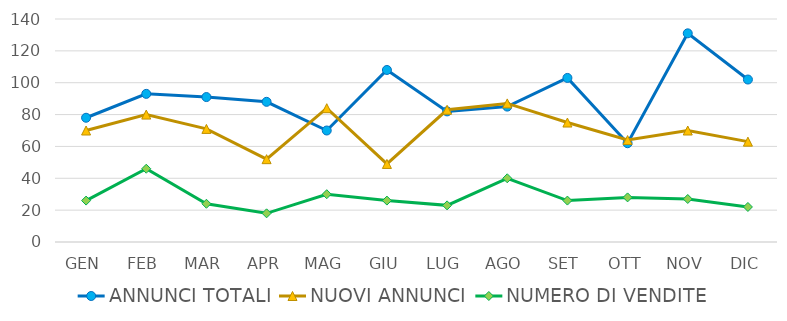
| Category | ANNUNCI TOTALI | NUOVI ANNUNCI | NUMERO DI VENDITE |
|---|---|---|---|
| GEN | 78 | 70 | 26 |
| FEB | 93 | 80 | 46 |
| MAR | 91 | 71 | 24 |
| APR | 88 | 52 | 18 |
| MAG | 70 | 84 | 30 |
| GIU | 108 | 49 | 26 |
| LUG | 82 | 83 | 23 |
| AGO | 85 | 87 | 40 |
| SET | 103 | 75 | 26 |
| OTT | 62 | 64 | 28 |
| NOV | 131 | 70 | 27 |
| DIC | 102 | 63 | 22 |